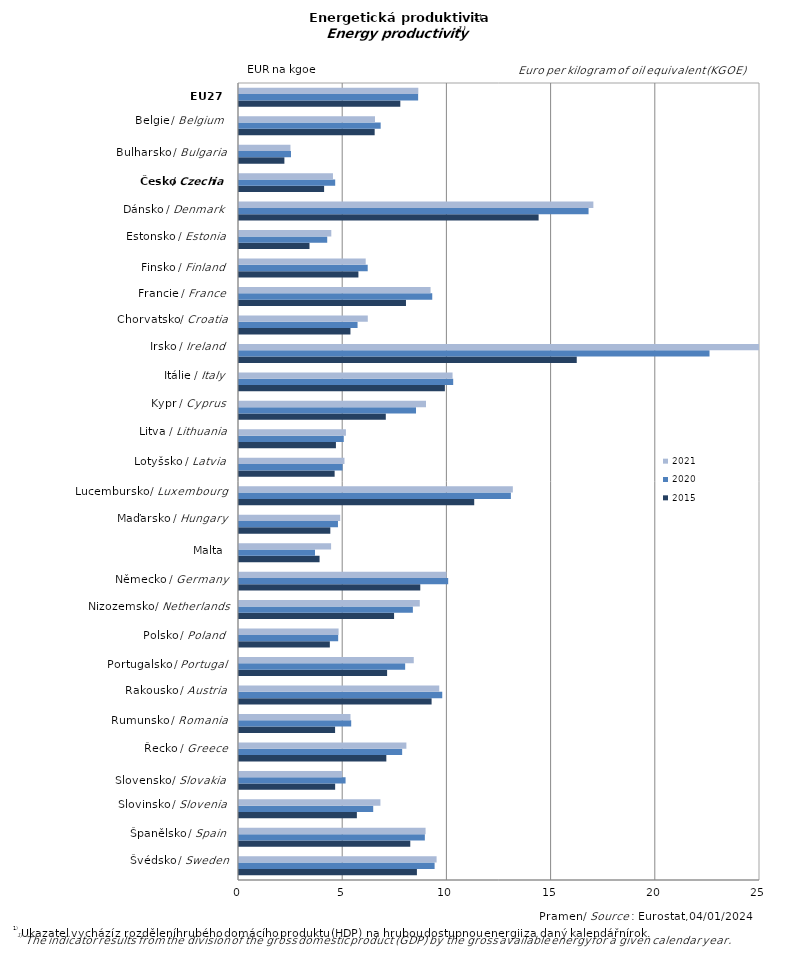
| Category | 2015 | 2020 | 2021 |
|---|---|---|---|
| Sweden | 8.537 | 9.386 | 9.482 |
| Spain | 8.219 | 8.918 | 8.953 |
| Slovenia | 5.656 | 6.44 | 6.786 |
| Slovakia | 4.614 | 5.114 | 4.953 |
| Greece | 7.07 | 7.829 | 8.032 |
| Romania | 4.611 | 5.384 | 5.35 |
| Austria | 9.242 | 9.753 | 9.61 |
| Portugal | 7.107 | 7.973 | 8.386 |
| Poland | 4.359 | 4.759 | 4.779 |
| Netherlands | 7.441 | 8.343 | 8.675 |
| Germany | 8.699 | 10.038 | 9.955 |
| Malta | 3.866 | 3.647 | 4.419 |
| Hungary | 4.382 | 4.749 | 4.856 |
| Luxembourg | 11.287 | 13.046 | 13.14 |
| Latvia | 4.589 | 4.969 | 5.061 |
| Lithuania | 4.651 | 5.027 | 5.131 |
| Cyprus | 7.044 | 8.494 | 8.973 |
| Italy | 9.879 | 10.278 | 10.248 |
| Ireland | 16.207 | 22.578 | 25.039 |
| Croatia | 5.348 | 5.689 | 6.18 |
| France | 8.012 | 9.273 | 9.193 |
| Finland | 5.73 | 6.176 | 6.08 |
| Estonia | 3.383 | 4.233 | 4.429 |
| Denmark | 14.377 | 16.773 | 17.004 |
| Czechia | 4.084 | 4.616 | 4.509 |
| Bulgaria | 2.178 | 2.495 | 2.469 |
| Belgium | 6.51 | 6.798 | 6.525 |
| European Union - 27 countries | 7.741 | 8.596 | 8.604 |